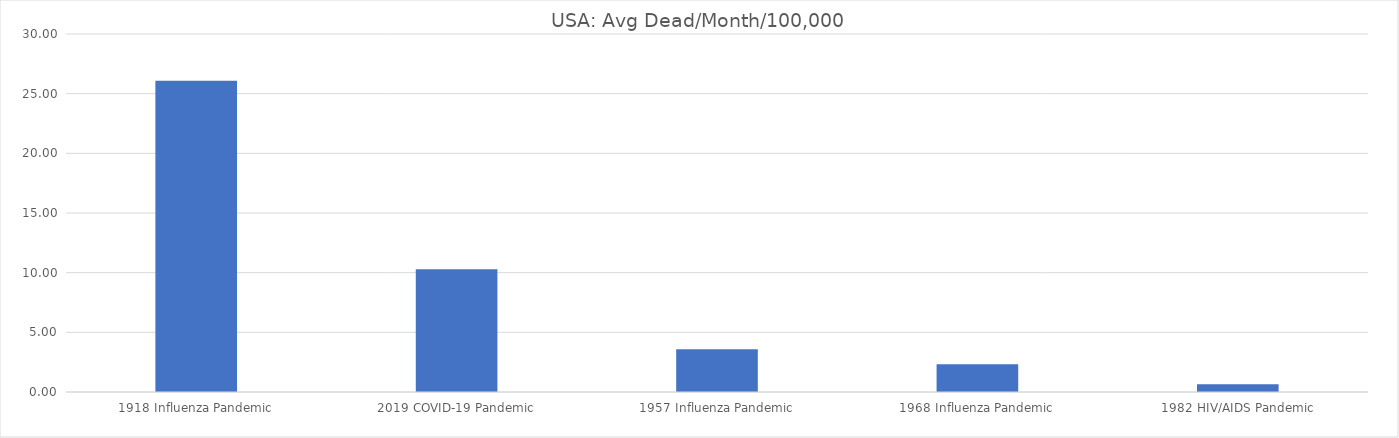
| Category | Avg Dead/Month/100,000 |
|---|---|
| 1918 Influenza Pandemic | 26.088 |
| 2019 COVID-19 Pandemic | 10.282 |
| 1957 Influenza Pandemic | 3.578 |
| 1968 Influenza Pandemic | 2.336 |
| 1982 HIV/AIDS Pandemic | 0.66 |